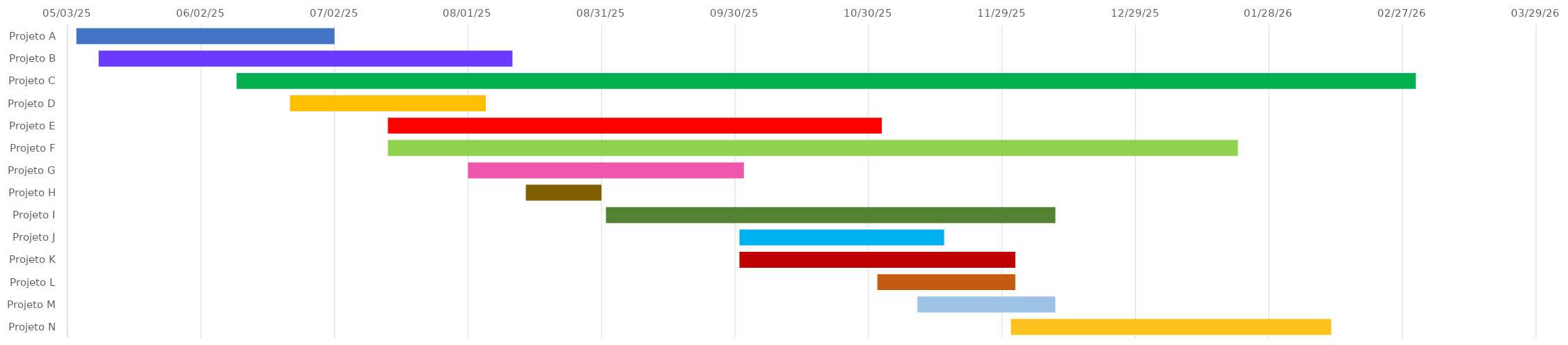
| Category | DATA DE 
INÍCIO | Duração |
|---|---|---|
| Projeto A | 2025-05-05 | 58 |
| Projeto B | 2025-05-10 | 93 |
| Projeto C | 2025-06-10 | 265 |
| Projeto D | 2025-06-22 | 44 |
| Projeto E | 2025-07-14 | 111 |
| Projeto F | 2025-07-14 | 191 |
| Projeto G | 2025-08-01 | 62 |
| Projeto H | 2025-08-14 | 17 |
| Projeto I | 2025-09-01 | 101 |
| Projeto J | 2025-10-01 | 46 |
| Projeto K | 2025-10-01 | 62 |
| Projeto L | 2025-11-01 | 31 |
| Projeto M | 2025-11-10 | 31 |
| Projeto N | 2025-12-01 | 72 |